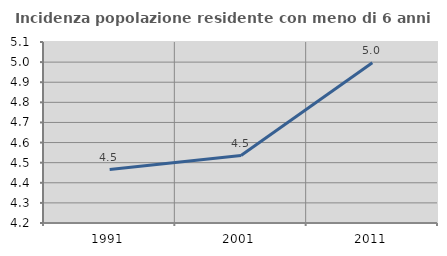
| Category | Incidenza popolazione residente con meno di 6 anni |
|---|---|
| 1991.0 | 4.466 |
| 2001.0 | 4.535 |
| 2011.0 | 4.997 |